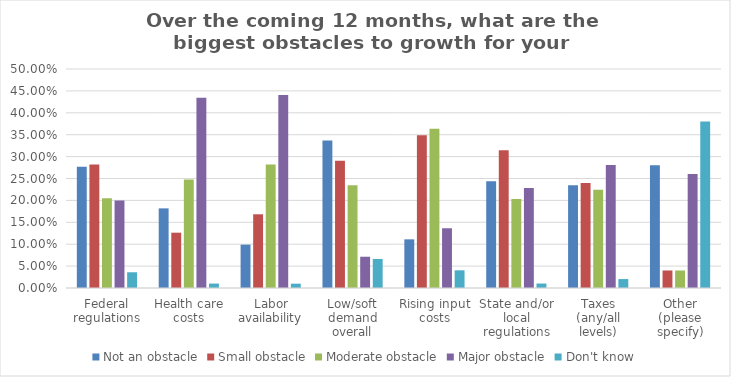
| Category | Not an obstacle | Small obstacle | Moderate obstacle | Major obstacle | Don't know |
|---|---|---|---|---|---|
| Federal regulations | 0.277 | 0.282 | 0.205 | 0.2 | 0.036 |
| Health care costs | 0.182 | 0.126 | 0.248 | 0.434 | 0.01 |
| Labor availability | 0.099 | 0.168 | 0.282 | 0.441 | 0.01 |
| Low/soft demand overall | 0.337 | 0.291 | 0.235 | 0.071 | 0.066 |
| Rising input costs | 0.111 | 0.348 | 0.364 | 0.136 | 0.04 |
| State and/or local regulations | 0.244 | 0.315 | 0.203 | 0.228 | 0.01 |
| Taxes (any/all levels) | 0.235 | 0.24 | 0.224 | 0.281 | 0.02 |
| Other (please specify) | 0.28 | 0.04 | 0.04 | 0.26 | 0.38 |